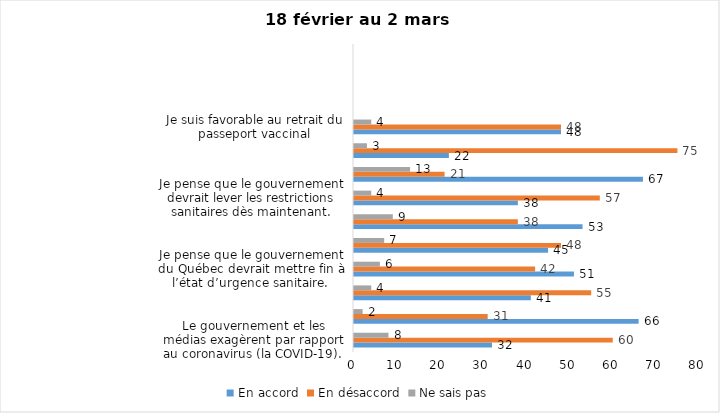
| Category | En accord | En désaccord | Ne sais pas |
|---|---|---|---|
| Le gouvernement et les médias exagèrent par rapport au coronavirus (la COVID-19). | 32 | 60 | 8 |
| Malgré la levée des mesures de confinement, je préfère limiter mes contacts avec d’autres personnes (par ex., en évitant les activités sociales et de groupes) | 66 | 31 | 2 |
| Je suis favorable à ce que le port du masque ne soit plus obligatoire au Québec. | 41 | 55 | 4 |
| Je pense que le gouvernement du Québec devrait mettre fin à l’état d’urgence sanitaire.  | 51 | 42 | 6 |
| Je n'ai pas peur du variant Omicron, car il semble moins dangereux pour la santé. | 45 | 48 | 7 |
| La vaccination obligatoire contre la COVID-19 mettrait fin à la pandémie. | 53 | 38 | 9 |
| Je pense que le gouvernement devrait lever les restrictions sanitaires dès maintenant. | 38 | 57 | 4 |
| Si moi ou mon enfant passons un test de dépistage rapide, je remplirai le formulaire de déclaration sur le site web du Gouvernement du Québec. | 67 | 21 | 13 |
| J’appuie les manifestations pour mettre fin aux mesures sanitaires. | 22 | 75 | 3 |
| Je suis favorable au retrait du passeport vaccinal | 48 | 48 | 4 |